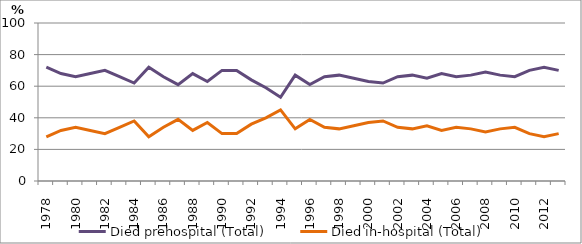
| Category | Died prehospital (Total) | Died in-hospital (Total) |
|---|---|---|
| 1978.0 | 72 | 28 |
| 1979.0 | 68 | 32 |
| 1980.0 | 66 | 34 |
| 1981.0 | 68 | 32 |
| 1982.0 | 70 | 30 |
| 1983.0 | 66 | 34 |
| 1984.0 | 62 | 38 |
| 1985.0 | 72 | 28 |
| 1986.0 | 66 | 34 |
| 1987.0 | 61 | 39 |
| 1988.0 | 68 | 32 |
| 1989.0 | 63 | 37 |
| 1990.0 | 70 | 30 |
| 1991.0 | 70 | 30 |
| 1992.0 | 64 | 36 |
| 1993.0 | 59 | 40 |
| 1994.0 | 53 | 45 |
| 1995.0 | 67 | 33 |
| 1996.0 | 61 | 39 |
| 1997.0 | 66 | 34 |
| 1998.0 | 67 | 33 |
| 1999.0 | 65 | 35 |
| 2000.0 | 63 | 37 |
| 2001.0 | 62 | 38 |
| 2002.0 | 66 | 34 |
| 2003.0 | 67 | 33 |
| 2004.0 | 65 | 35 |
| 2005.0 | 68 | 32 |
| 2006.0 | 66 | 34 |
| 2007.0 | 67 | 33 |
| 2008.0 | 69 | 31 |
| 2009.0 | 67 | 33 |
| 2010.0 | 66 | 34 |
| 2011.0 | 70 | 30 |
| 2012.0 | 72 | 28 |
| 2013.0 | 70 | 30 |